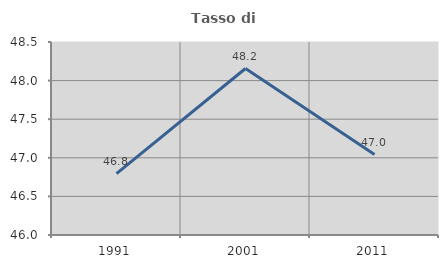
| Category | Tasso di occupazione   |
|---|---|
| 1991.0 | 46.796 |
| 2001.0 | 48.157 |
| 2011.0 | 47.041 |